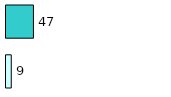
| Category | Series 0 | Series 1 |
|---|---|---|
| 0 | 9 | 47 |